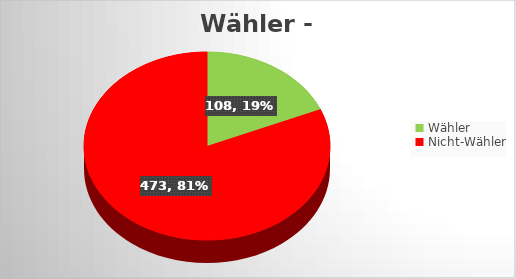
| Category | Series 0 |
|---|---|
| Wähler | 108 |
| Nicht-Wähler | 473 |